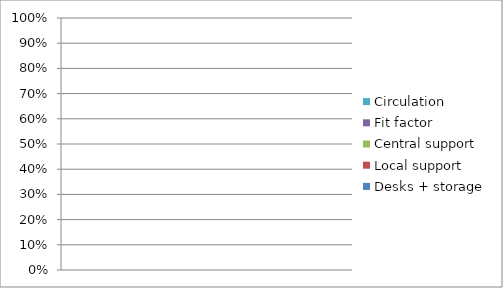
| Category | Desks + storage | Local support | Central support | Fit factor | Circulation |
|---|---|---|---|---|---|
| 0 | 0 | 0 | 0 | 0 | 0 |